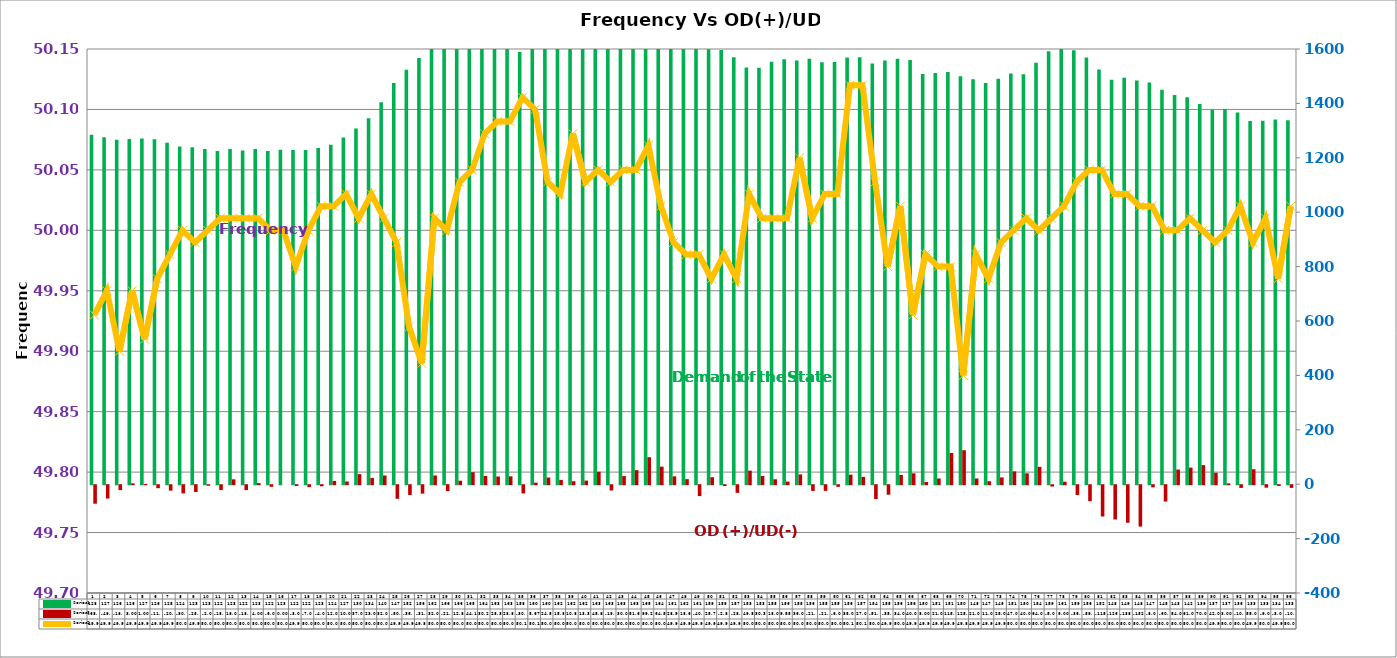
| Category | Series 2 | Series 4 |
|---|---|---|
| 0 | 1285 | -68 |
| 1 | 1276 | -49 |
| 2 | 1266 | -18 |
| 3 | 1269 | 3 |
| 4 | 1271 | 1 |
| 5 | 1268 | -11 |
| 6 | 1255 | -20 |
| 7 | 1242 | -30 |
| 8 | 1239 | -25 |
| 9 | 1232 | -2 |
| 10 | 1225 | -18 |
| 11 | 1232 | 18 |
| 12 | 1227 | -18 |
| 13 | 1232 | 4 |
| 14 | 1225 | -6 |
| 15 | 1230 | 0 |
| 16 | 1229 | -3 |
| 17 | 1229 | -7 |
| 18 | 1236 | -4 |
| 19 | 1248 | 12 |
| 20 | 1275 | 10 |
| 21 | 1308 | 37 |
| 22 | 1345 | 23 |
| 23 | 1404 | 32 |
| 24 | 1475 | -50 |
| 25 | 1524 | -36 |
| 26 | 1567 | -31 |
| 27 | 1621 | 32 |
| 28 | 1662 | -21.782 |
| 29 | 1667 | 12.876 |
| 30 | 1657 | 44.106 |
| 31 | 1641 | 30.198 |
| 32 | 1634 | 28.316 |
| 33 | 1635 | 28.816 |
| 34 | 1589 | -30.121 |
| 35 | 1603 | 5.666 |
| 36 | 1608 | 24.543 |
| 37 | 1623 | 15.883 |
| 38 | 1621 | 10.883 |
| 39 | 1626 | 13.317 |
| 40 | 1631 | 45.821 |
| 41 | 1637 | -19.435 |
| 42 | 1638 | 30.03 |
| 43 | 1633 | 51.65 |
| 44 | 1658 | 99.249 |
| 45 | 1643 | 64.529 |
| 46 | 1615 | 28.982 |
| 47 | 1620 | 18.614 |
| 48 | 1610 | -40.093 |
| 49 | 1599 | 25.754 |
| 50 | 1596 | -2.864 |
| 51 | 1570 | -28.214 |
| 52 | 1532 | 49.806 |
| 53 | 1531 | 30.356 |
| 54 | 1553 | 18.086 |
| 55 | 1562 | 9.553 |
| 56 | 1558 | 36 |
| 57 | 1564 | -21 |
| 58 | 1551 | -21 |
| 59 | 1552 | -6 |
| 60 | 1569 | 35 |
| 61 | 1570 | 27 |
| 62 | 1547 | -51 |
| 63 | 1558 | -35 |
| 64 | 1564 | 34 |
| 65 | 1560 | 40 |
| 66 | 1508 | 8 |
| 67 | 1512 | 21 |
| 68 | 1515 | 115 |
| 69 | 1500 | 125 |
| 70 | 1489 | 21 |
| 71 | 1475 | 11 |
| 72 | 1491 | 25 |
| 73 | 1510 | 47 |
| 74 | 1507 | 40 |
| 75 | 1549 | 64 |
| 76 | 1592 | -5 |
| 77 | 1617 | 9 |
| 78 | 1595 | -36 |
| 79 | 1569 | -59 |
| 80 | 1525 | -115 |
| 81 | 1487 | -126 |
| 82 | 1494 | -138 |
| 83 | 1484 | -152 |
| 84 | 1477 | -8 |
| 85 | 1450 | -60 |
| 86 | 1431 | 54 |
| 87 | 1423 | 61 |
| 88 | 1398 | 70 |
| 89 | 1377 | 42 |
| 90 | 1379 | 3 |
| 91 | 1367 | -10 |
| 92 | 1335 | 55 |
| 93 | 1336 | -9 |
| 94 | 1341 | -3 |
| 95 | 1338 | -10 |